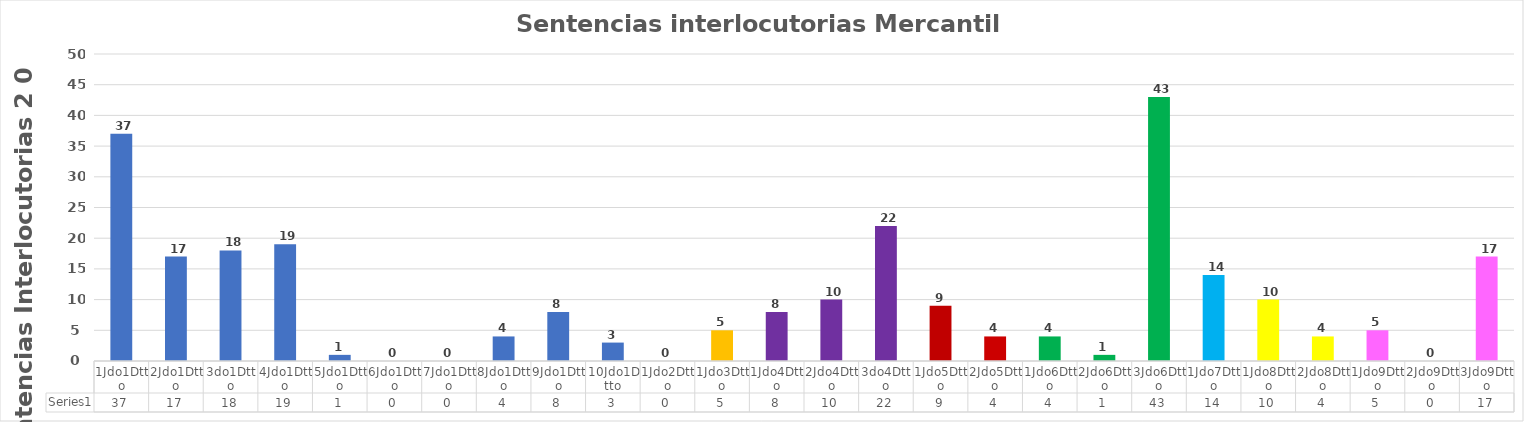
| Category | Series 0 |
|---|---|
| 1Jdo1Dtto | 37 |
| 2Jdo1Dtto | 17 |
| 3do1Dtto | 18 |
| 4Jdo1Dtto | 19 |
| 5Jdo1Dtto | 1 |
| 6Jdo1Dtto | 0 |
| 7Jdo1Dtto | 0 |
| 8Jdo1Dtto | 4 |
| 9Jdo1Dtto | 8 |
| 10Jdo1Dtto | 3 |
| 1Jdo2Dtto | 0 |
| 1Jdo3Dtto | 5 |
| 1Jdo4Dtto | 8 |
| 2Jdo4Dtto | 10 |
| 3do4Dtto | 22 |
| 1Jdo5Dtto | 9 |
| 2Jdo5Dtto | 4 |
| 1Jdo6Dtto | 4 |
| 2Jdo6Dtto | 1 |
| 3Jdo6Dtto | 43 |
| 1Jdo7Dtto | 14 |
| 1Jdo8Dtto | 10 |
| 2Jdo8Dtto | 4 |
| 1Jdo9Dtto | 5 |
| 2Jdo9Dtto | 0 |
| 3Jdo9Dtto | 17 |